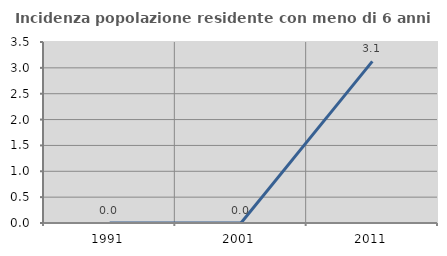
| Category | Incidenza popolazione residente con meno di 6 anni |
|---|---|
| 1991.0 | 0 |
| 2001.0 | 0 |
| 2011.0 | 3.125 |